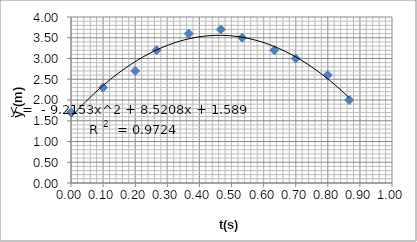
| Category | Series 0 |
|---|---|
| 0.0 | 1.7 |
| 0.1 | 2.3 |
| 0.2 | 2.7 |
| 0.26666666666666666 | 3.2 |
| 0.36666666666666664 | 3.6 |
| 0.4666666666666667 | 3.7 |
| 0.5333333333333333 | 3.5 |
| 0.6333333333333333 | 3.2 |
| 0.7 | 3 |
| 0.8 | 2.6 |
| 0.8666666666666667 | 2 |